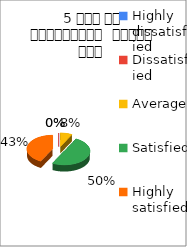
| Category | 5 समय पर पाठ्यक्रम  पूर्ण हुआ  |
|---|---|
| Highly dissatisfied | 0 |
| Dissatisfied | 0 |
| Average | 3 |
| Satisfied | 20 |
| Highly satisfied | 17 |